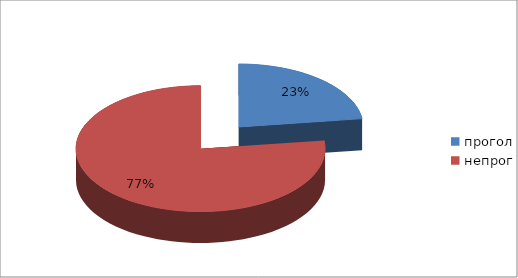
| Category | Series 0 |
|---|---|
| прогол | 30 |
| непрог | 101 |